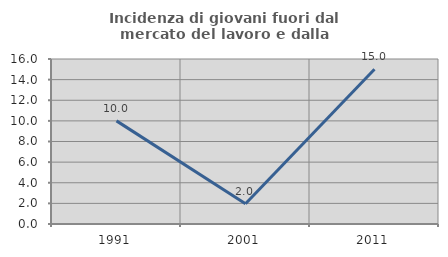
| Category | Incidenza di giovani fuori dal mercato del lavoro e dalla formazione  |
|---|---|
| 1991.0 | 10 |
| 2001.0 | 1.961 |
| 2011.0 | 15 |